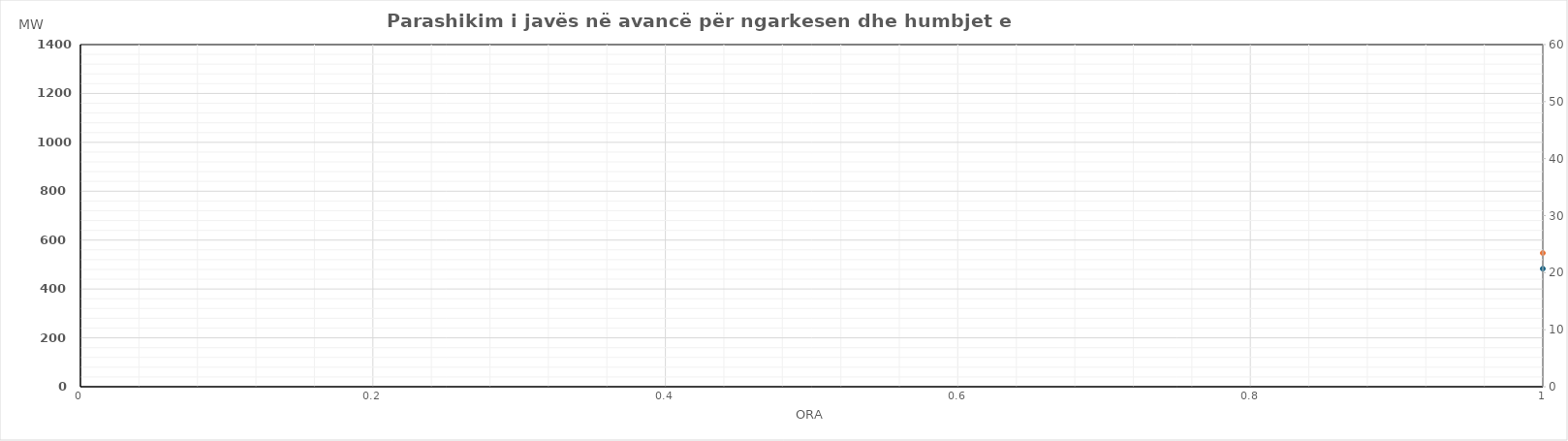
| Category | Ngarkesa (MWh) |
|---|---|
| 0 | 547.04 |
| 1 | 480.54 |
| 2 | 483.44 |
| 3 | 473.44 |
| 4 | 482.34 |
| 5 | 534.17 |
| 6 | 711.65 |
| 7 | 933.18 |
| 8 | 1018.06 |
| 9 | 1017.2 |
| 10 | 981.46 |
| 11 | 966.24 |
| 12 | 957.6 |
| 13 | 999.69 |
| 14 | 985.49 |
| 15 | 998.95 |
| 16 | 1028.4 |
| 17 | 1116.11 |
| 18 | 1205.56 |
| 19 | 1198.71 |
| 20 | 1165.39 |
| 21 | 1065.84 |
| 22 | 914.76 |
| 23 | 750.26 |
| 24 | 596.36 |
| 25 | 532.04 |
| 26 | 541.18 |
| 27 | 532.88 |
| 28 | 543.37 |
| 29 | 611.76 |
| 30 | 786.57 |
| 31 | 1007.13 |
| 32 | 1058.43 |
| 33 | 1018.31 |
| 34 | 966.83 |
| 35 | 937.32 |
| 36 | 925.39 |
| 37 | 984.02 |
| 38 | 976.4 |
| 39 | 980.99 |
| 40 | 1011.23 |
| 41 | 1131.18 |
| 42 | 1218.56 |
| 43 | 1215.46 |
| 44 | 1178.49 |
| 45 | 1072.37 |
| 46 | 901.87 |
| 47 | 732.45 |
| 48 | 625.18 |
| 49 | 541.09 |
| 50 | 529.87 |
| 51 | 519.17 |
| 52 | 529.97 |
| 53 | 598.54 |
| 54 | 779.07 |
| 55 | 1002.34 |
| 56 | 1089.73 |
| 57 | 1084.74 |
| 58 | 1032.64 |
| 59 | 992.34 |
| 60 | 998.74 |
| 61 | 1033.23 |
| 62 | 1034.32 |
| 63 | 1037.46 |
| 64 | 1066.23 |
| 65 | 1166.4 |
| 66 | 1240.86 |
| 67 | 1235.87 |
| 68 | 1199.79 |
| 69 | 1084.38 |
| 70 | 919.81 |
| 71 | 755.29 |
| 72 | 606.09 |
| 73 | 538.59 |
| 74 | 551.89 |
| 75 | 539.98 |
| 76 | 548.18 |
| 77 | 615.27 |
| 78 | 792.15 |
| 79 | 1020.34 |
| 80 | 1117.16 |
| 81 | 1113.67 |
| 82 | 1077.56 |
| 83 | 1013.31 |
| 84 | 1028.93 |
| 85 | 1055.75 |
| 86 | 1032.84 |
| 87 | 1080.06 |
| 88 | 1088.04 |
| 89 | 1167.9 |
| 90 | 1227.76 |
| 91 | 1228.96 |
| 92 | 1200.5 |
| 93 | 1087.09 |
| 94 | 928.79 |
| 95 | 761.2 |
| 96 | 648.41 |
| 97 | 560.31 |
| 98 | 557.09 |
| 99 | 558.49 |
| 100 | 568.08 |
| 101 | 635.37 |
| 102 | 821.06 |
| 103 | 1051.84 |
| 104 | 1095.86 |
| 105 | 1068.29 |
| 106 | 1017.48 |
| 107 | 975.53 |
| 108 | 953.35 |
| 109 | 970.54 |
| 110 | 940.36 |
| 111 | 949.61 |
| 112 | 980.28 |
| 113 | 1103.63 |
| 114 | 1225.99 |
| 115 | 1226.27 |
| 116 | 1199.41 |
| 117 | 1095.71 |
| 118 | 916.31 |
| 119 | 737.7 |
| 120 | 656.44 |
| 121 | 589.75 |
| 122 | 559.64 |
| 123 | 559.64 |
| 124 | 567.67 |
| 125 | 613.28 |
| 126 | 741.02 |
| 127 | 922.21 |
| 128 | 1066.13 |
| 129 | 1098.17 |
| 130 | 1092.16 |
| 131 | 1079.6 |
| 132 | 1095.72 |
| 133 | 1134.71 |
| 134 | 1135 |
| 135 | 1122.68 |
| 136 | 1098.45 |
| 137 | 1171.97 |
| 138 | 1241.44 |
| 139 | 1221.64 |
| 140 | 1175.35 |
| 141 | 1068.08 |
| 142 | 929.54 |
| 143 | 795.42 |
| 144 | 713.89 |
| 145 | 633.2 |
| 146 | 574.39 |
| 147 | 560.79 |
| 148 | 562.77 |
| 149 | 591.88 |
| 150 | 686.37 |
| 151 | 848.06 |
| 152 | 966.28 |
| 153 | 993.62 |
| 154 | 988.01 |
| 155 | 933.95 |
| 156 | 937.57 |
| 157 | 940.76 |
| 158 | 909.45 |
| 159 | 915.63 |
| 160 | 921.1 |
| 161 | 1067.12 |
| 162 | 1178.69 |
| 163 | 1194.59 |
| 164 | 1166.7 |
| 165 | 1048.93 |
| 166 | 877.04 |
| 167 | 699.12 |